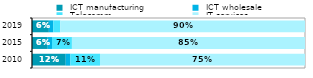
| Category |  ICT manufacturing |  ICT wholesale |  Telecomm. |  IT services |
|---|---|---|---|---|
| 2010.0 | 0.124 | 0.017 | 0.108 | 0.751 |
| 2015.0 | 0.058 | 0.015 | 0.073 | 0.854 |
| 2019.0 | 0.062 | 0.016 | 0.026 | 0.896 |